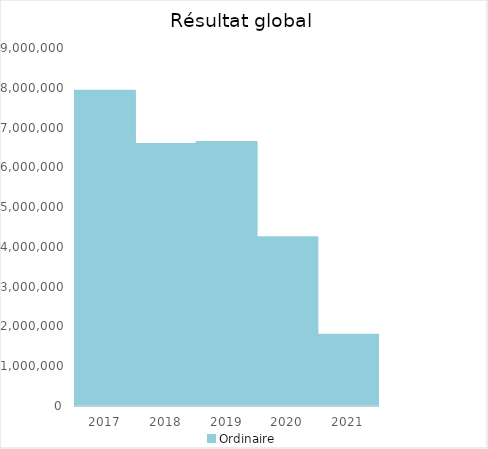
| Category |   | Ordinaire |    |
|---|---|---|---|
| 2017.0 |  | 7927167.04 |  |
| 2018.0 |  | 6583800.33 |  |
| 2019.0 |  | 6633833.85 |  |
| 2020.0 |  | 4242325.35 |  |
| 2021.0 |  | 1793611.17 |  |